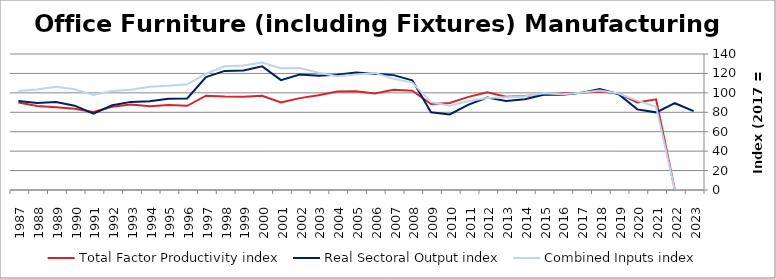
| Category | Total Factor Productivity index | Real Sectoral Output index | Combined Inputs index |
|---|---|---|---|
| 2023.0 | 0 | 81.128 | 0 |
| 2022.0 | 0 | 89.343 | 0 |
| 2021.0 | 93.298 | 79.925 | 85.666 |
| 2020.0 | 90.205 | 82.973 | 91.983 |
| 2019.0 | 99.25 | 98.59 | 99.335 |
| 2018.0 | 101.328 | 103.828 | 102.467 |
| 2017.0 | 100 | 100 | 100 |
| 2016.0 | 99.452 | 97.958 | 98.497 |
| 2015.0 | 98.379 | 98.01 | 99.625 |
| 2014.0 | 96.658 | 93.327 | 96.554 |
| 2013.0 | 95.956 | 91.624 | 95.485 |
| 2012.0 | 100.575 | 95.226 | 94.682 |
| 2011.0 | 95.899 | 87.867 | 91.624 |
| 2010.0 | 89.636 | 77.792 | 86.787 |
| 2009.0 | 88.513 | 80.08 | 90.472 |
| 2008.0 | 102.187 | 112.956 | 110.538 |
| 2007.0 | 103.174 | 118.251 | 114.613 |
| 2006.0 | 99.3 | 119.7 | 120.544 |
| 2005.0 | 101.603 | 120.906 | 118.999 |
| 2004.0 | 101.292 | 118.652 | 117.139 |
| 2003.0 | 97.489 | 117.659 | 120.69 |
| 2002.0 | 94.574 | 118.774 | 125.589 |
| 2001.0 | 90.143 | 113.091 | 125.457 |
| 2000.0 | 96.966 | 127.308 | 131.292 |
| 1999.0 | 95.918 | 122.99 | 128.224 |
| 1998.0 | 96.279 | 122.601 | 127.339 |
| 1997.0 | 97.121 | 116.199 | 119.643 |
| 1996.0 | 86.649 | 94.274 | 108.8 |
| 1995.0 | 87.496 | 93.827 | 107.236 |
| 1994.0 | 86.142 | 91.481 | 106.198 |
| 1993.0 | 87.918 | 90.711 | 103.177 |
| 1992.0 | 85.713 | 87.262 | 101.807 |
| 1991.0 | 80.224 | 78.474 | 97.818 |
| 1990.0 | 83.727 | 86.81 | 103.682 |
| 1989.0 | 85.085 | 90.514 | 106.381 |
| 1988.0 | 86.476 | 89.543 | 103.547 |
| 1987.0 | 90.087 | 91.73 | 101.824 |